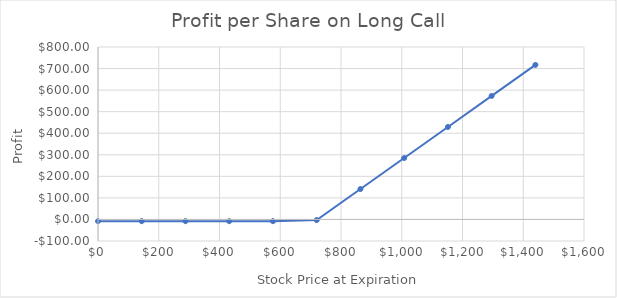
| Category | Profit per Share |
|---|---|
| 0.0 | -8 |
| 144.0 | -8 |
| 288.0 | -8 |
| 432.0 | -8 |
| 576.0 | -8 |
| 720.0 | -3 |
| 864.0 | 141 |
| 1007.9999999999999 | 285 |
| 1152.0 | 429 |
| 1296.0 | 573 |
| 1440.0 | 717 |